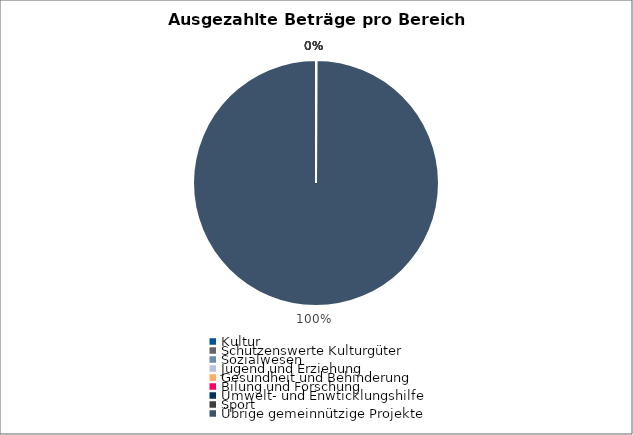
| Category | Series 0 |
|---|---|
| Kultur | 0 |
| Schützenswerte Kulturgüter | 0 |
| Sozialwesen | 0 |
| Jugend und Erziehung | 0 |
| Gesundheit und Behinderung | 0 |
| Bilung und Forschung | 0 |
| Umwelt- und Enwticklungshilfe | 0 |
| Sport | 0 |
| Übrige gemeinnützige Projekte | 15768 |